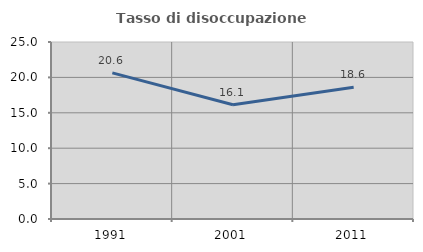
| Category | Tasso di disoccupazione giovanile  |
|---|---|
| 1991.0 | 20.635 |
| 2001.0 | 16.129 |
| 2011.0 | 18.605 |